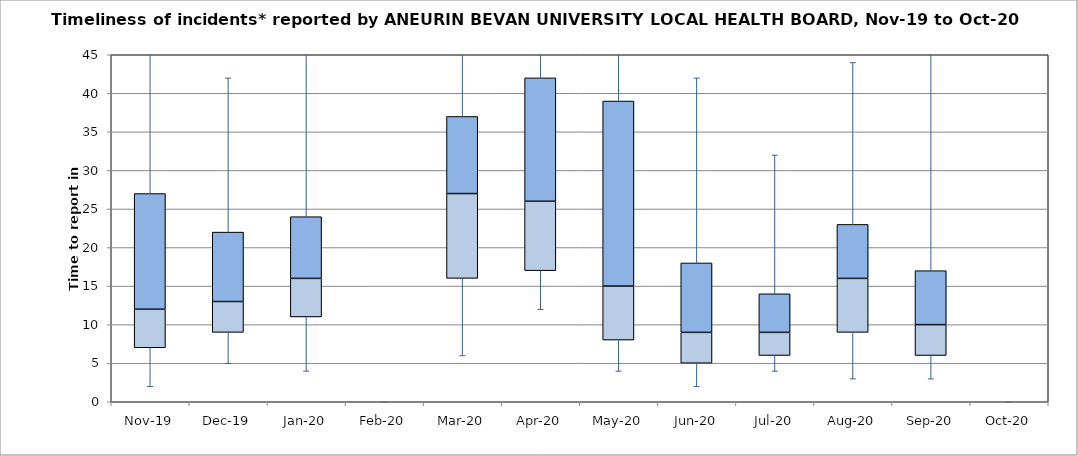
| Category | Series 0 | Series 1 | Series 2 |
|---|---|---|---|
| Nov-19 | 7 | 5 | 15 |
| Dec-19 | 9 | 4 | 9 |
| Jan-20 | 11 | 5 | 8 |
| Feb-20 | 0 | 0 | 0 |
| Mar-20 | 16 | 11 | 10 |
| Apr-20 | 17 | 9 | 16 |
| May-20 | 8 | 7 | 24 |
| Jun-20 | 5 | 4 | 9 |
| Jul-20 | 6 | 3 | 5 |
| Aug-20 | 9 | 7 | 7 |
| Sep-20 | 6 | 4 | 7 |
| Oct-20 | 0 | 0 | 0 |